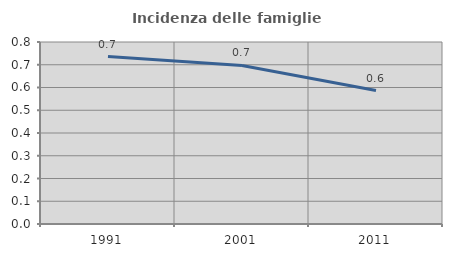
| Category | Incidenza delle famiglie numerose |
|---|---|
| 1991.0 | 0.736 |
| 2001.0 | 0.697 |
| 2011.0 | 0.586 |